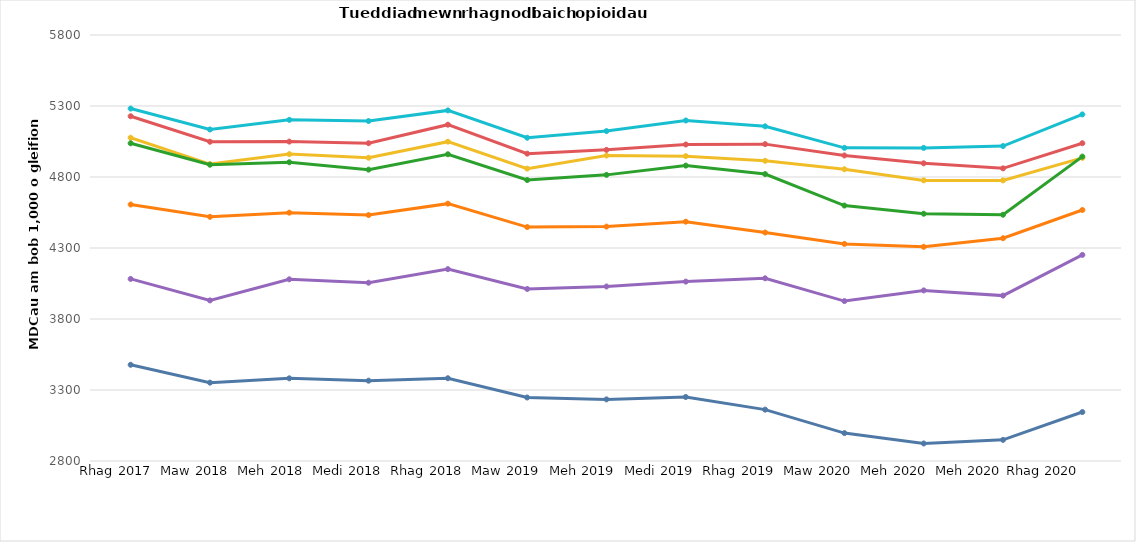
| Category | Aneurin Bevan | Betsi Cadwaladr | Cardiff And Vale | Cwm Taf Morgannwg | Hywel Dda | Powys | Swansea Bay |
|---|---|---|---|---|---|---|---|
| Dec 2017 | 5076.587 | 5037.534 | 3477.703 | 5281.987 | 5227.867 | 4082.263 | 4606.366 |
| Mar 2018 | 4890.995 | 4886.486 | 3351.779 | 5134.725 | 5048.219 | 3930.762 | 4519.329 |
| Jun 2018 | 4961.121 | 4903.831 | 3382.108 | 5202.54 | 5049.332 | 4079.453 | 4548.904 |
| Sep 2018 | 4935.555 | 4851.83 | 3365.699 | 5194.195 | 5037.87 | 4055.442 | 4532.059 |
| Dec 2018 | 5048.809 | 4960.236 | 3382.84 | 5268.978 | 5168.405 | 4151.196 | 4612.319 |
| Mar 2019 | 4858.978 | 4778.65 | 3247.183 | 5076.346 | 4964.367 | 4011.47 | 4447.348 |
| Jun 2019 | 4951.389 | 4815.014 | 3233.947 | 5123.202 | 4991.189 | 4028.846 | 4450.689 |
| Sep 2019 | 4946.986 | 4880.331 | 3250.689 | 5198.082 | 5028.814 | 4063.264 | 4485.51 |
| Dec 2019 | 4914.08 | 4820.506 | 3161.74 | 5156.771 | 5031.447 | 4086.712 | 4409.034 |
| Mar 2020 | 4854.56 | 4598.965 | 2996.417 | 5005.394 | 4951.697 | 3926.222 | 4328.993 |
| Jun 2020 | 4776.138 | 4541.2 | 2923.315 | 5005.07 | 4896.482 | 4001.239 | 4308.212 |
| Sep 2020 | 4776.094 | 4534.252 | 2948.796 | 5017.934 | 4860.956 | 3964.773 | 4368.825 |
| Dec 2020 | 4934.693 | 4943.766 | 3144.792 | 5240.628 | 5037.872 | 4251.498 | 4567.663 |